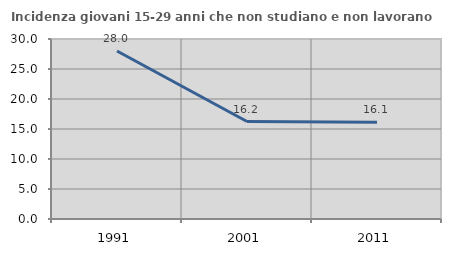
| Category | Incidenza giovani 15-29 anni che non studiano e non lavorano  |
|---|---|
| 1991.0 | 27.998 |
| 2001.0 | 16.244 |
| 2011.0 | 16.129 |